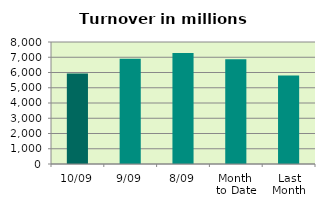
| Category | Series 0 |
|---|---|
| 10/09 | 5940.263 |
| 9/09 | 6901.273 |
| 8/09 | 7273.344 |
| Month 
to Date | 6876.71 |
| Last
Month | 5795.357 |